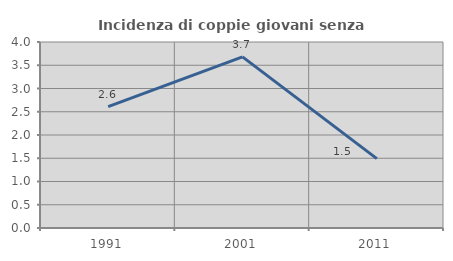
| Category | Incidenza di coppie giovani senza figli |
|---|---|
| 1991.0 | 2.61 |
| 2001.0 | 3.681 |
| 2011.0 | 1.491 |